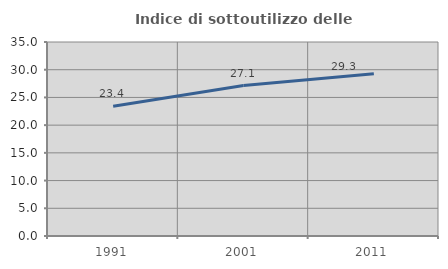
| Category | Indice di sottoutilizzo delle abitazioni  |
|---|---|
| 1991.0 | 23.425 |
| 2001.0 | 27.137 |
| 2011.0 | 29.279 |